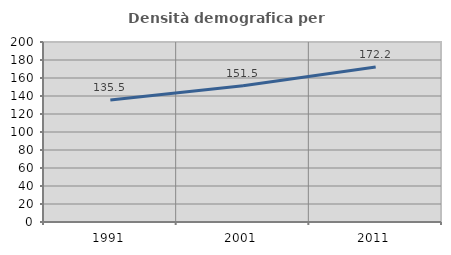
| Category | Densità demografica |
|---|---|
| 1991.0 | 135.514 |
| 2001.0 | 151.463 |
| 2011.0 | 172.222 |